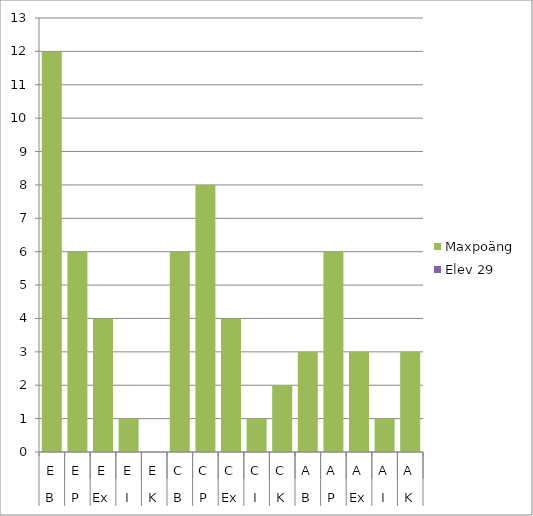
| Category | Maxpoäng | Elev 29 |
|---|---|---|
| 0 | 12 | 0 |
| 1 | 6 | 0 |
| 2 | 4 | 0 |
| 3 | 1 | 0 |
| 4 | 0 | 0 |
| 5 | 6 | 0 |
| 6 | 8 | 0 |
| 7 | 4 | 0 |
| 8 | 1 | 0 |
| 9 | 2 | 0 |
| 10 | 3 | 0 |
| 11 | 6 | 0 |
| 12 | 3 | 0 |
| 13 | 1 | 0 |
| 14 | 3 | 0 |